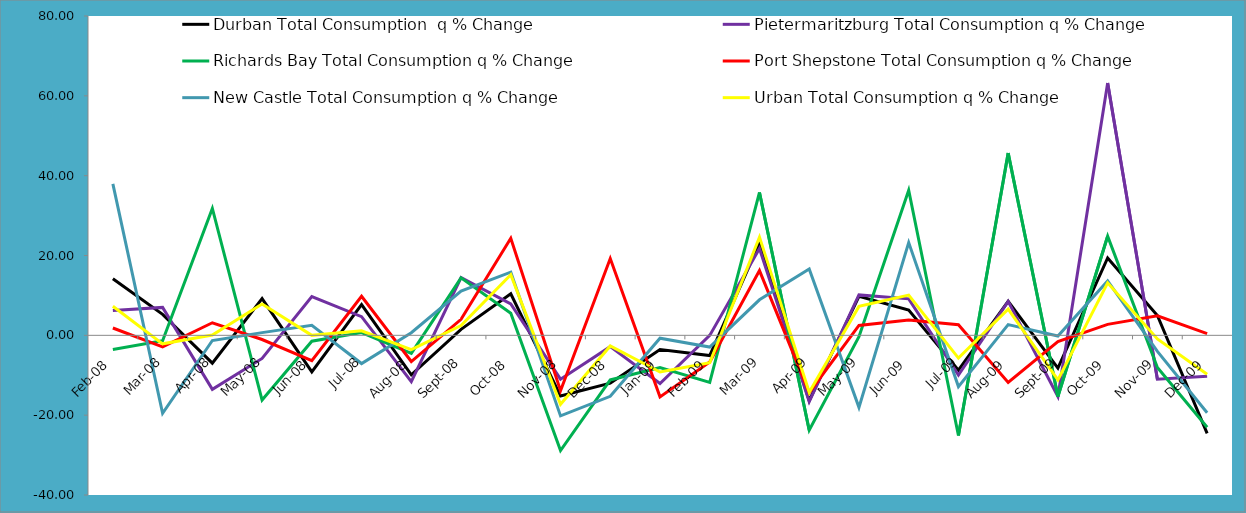
| Category | Durban Total Consumption  q % Change | Pietermaritzburg Total Consumption q % Change | Richards Bay Total Consumption q % Change | Port Shepstone Total Consumption q % Change | New Castle Total Consumption q % Change | Urban Total Consumption q % Change |
|---|---|---|---|---|---|---|
| 2008-02-01 | 14.19 | 6.206 | -3.555 | 1.832 | 37.943 | 7.287 |
| 2008-03-01 | 5.261 | 7.002 | -1.341 | -2.904 | -19.543 | -2.134 |
| 2008-04-01 | -6.98 | -13.531 | 31.802 | 3.149 | -1.296 | 0.087 |
| 2008-05-01 | 9.215 | -5.785 | -16.206 | -1.051 | 0.676 | 7.833 |
| 2008-06-01 | -9.166 | 9.697 | -1.464 | -6.321 | 2.502 | -0.004 |
| 2008-07-01 | 7.692 | 4.678 | 0.684 | 9.779 | -7.072 | 1.122 |
| 2008-08-01 | -9.9 | -11.624 | -4.526 | -6.562 | 0.662 | -3.604 |
| 2008-09-01 | 1.489 | 14.455 | 14.408 | 4.013 | 11.071 | 2.463 |
| 2008-10-01 | 10.392 | 7.876 | 5.514 | 24.315 | 15.816 | 15.172 |
| 2008-11-01 | -15.196 | -10.978 | -28.85 | -13.885 | -20.183 | -17.285 |
| 2008-12-01 | -11.975 | -2.834 | -11.176 | 19.235 | -15.278 | -2.657 |
| 2009-01-01 | -3.536 | -12.079 | -8.046 | -15.415 | -0.714 | -9.186 |
| 2009-02-01 | -5.068 | -0.012 | -11.784 | -6.67 | -2.947 | -6.881 |
| 2009-03-01 | 23.132 | 21.742 | 35.795 | 16.222 | 8.9 | 24.597 |
| 2009-04-01 | -16.367 | -16.612 | -23.772 | -14.363 | 16.623 | -14.249 |
| 2009-05-01 | 9.795 | 10.118 | -0.338 | 2.472 | -18.044 | 7.246 |
| 2009-06-01 | 6.313 | 9.137 | 36.355 | 3.812 | 23.233 | 10.076 |
| 2009-07-01 | -8.721 | -9.968 | -25.096 | 2.649 | -12.836 | -5.701 |
| 2009-08-01 | 8.527 | 8.517 | 45.65 | -11.79 | 2.7 | 6.551 |
| 2009-09-01 | -8.192 | -15.323 | -15.332 | -1.538 | -0.168 | -11.179 |
| 2009-10-01 | 19.385 | 63.224 | 24.829 | 2.743 | 13.635 | 13.15 |
| 2009-11-01 | 4.966 | -10.988 | -8.042 | 4.879 | -4.028 | -0.89 |
| 2009-12-01 | -24.543 | -10.238 | -23.022 | 0.442 | -19.389 | -9.732 |